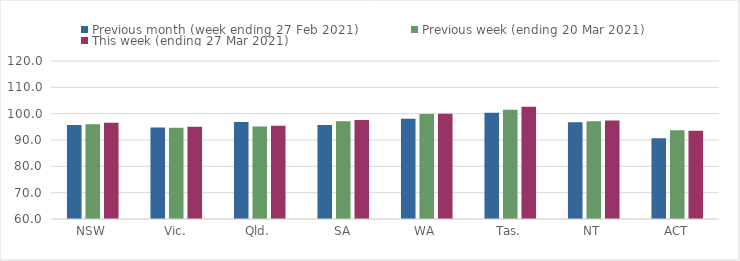
| Category | Previous month (week ending 27 Feb 2021) | Previous week (ending 20 Mar 2021) | This week (ending 27 Mar 2021) |
|---|---|---|---|
| NSW | 95.67 | 95.96 | 96.56 |
| Vic. | 94.71 | 94.67 | 95.06 |
| Qld. | 96.8 | 95.15 | 95.43 |
| SA | 95.74 | 97.16 | 97.59 |
| WA | 98.05 | 99.86 | 99.98 |
| Tas. | 100.34 | 101.51 | 102.64 |
| NT | 96.76 | 97.12 | 97.37 |
| ACT | 90.66 | 93.75 | 93.55 |